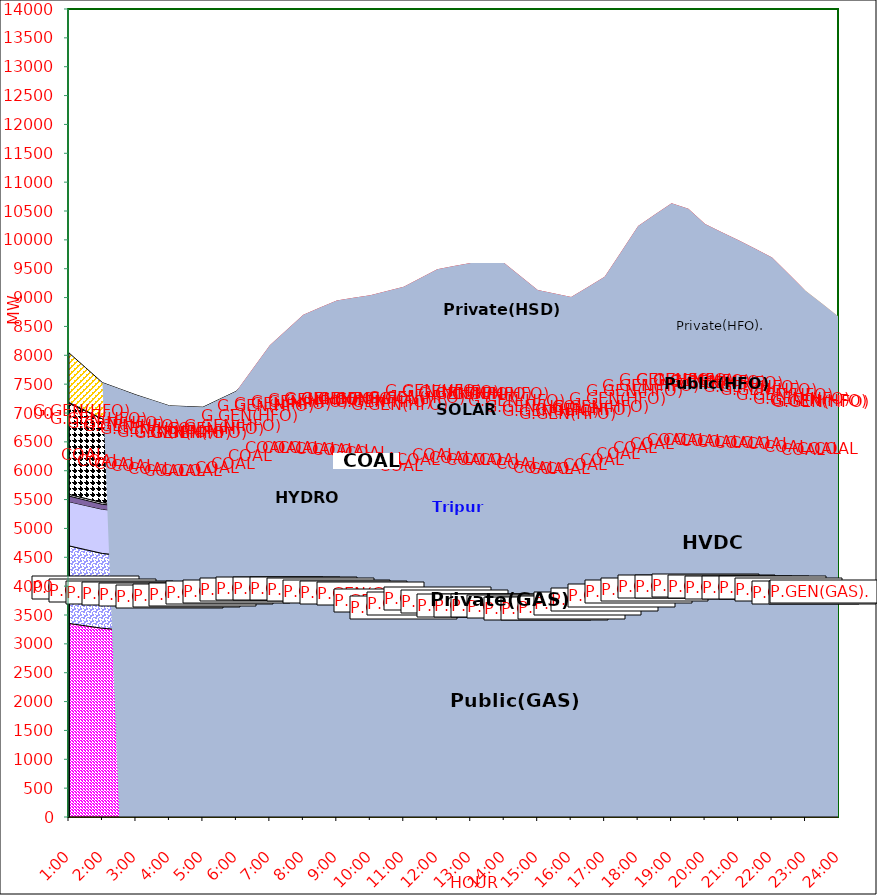
| Category | GAS | P.GEN(GAS). |  HVDC | TRIPURA | HYDRO | COAL | SOLAR | G.GEN(HFO) | P.GEN(HFO). | G.GEN(HSD) | P.GEN(HSD) | SHORTAGE | Total Energy Gen 209.351 MKWHr 
Energy Not Served   7.118 MKWHr 
Energy Requirement     216.469 MKWHr  |
|---|---|---|---|---|---|---|---|---|---|---|---|---|---|
| 1:00 | 3354 | 1344 | 765 | 98 | 30 | 1575 | 0 | 16 | 859 | 0 | 0 | 0 |  |
| 1:30 | 3312 | 1320 | 765 | 92 | 30 | 1513 | 0 | 8 | 743.5 | 0 | 0 | 0 |  |
| 2:00 | 3270 | 1296 | 765 | 86 | 30 | 1451 | 0 | 0 | 628 | 0 | 0 | 0 |  |
| 2:30 | 3247.5 | 1291.5 | 765 | 88 | 30 | 1421 | 0 | 0 | 577 | 0 | 0 | 0 |  |
| 3:00 | 3225 | 1287 | 765 | 90 | 30 | 1391 | 0 | 0 | 526 | 0 | 0 | 0 |  |
| 3:30 | 3224 | 1247.5 | 765 | 90 | 30 | 1376.5 | 0 | 0 | 486 | 0 | 0 | 0 |  |
| 4:00 | 3223 | 1208 | 765 | 90 | 30 | 1362 | 0 | 0 | 446 | 0 | 0 | 0 |  |
| 4:30 | 3237.5 | 1207 | 765 | 89 | 30 | 1342 | 0 | 0 | 442 | 0 | 0 | 0 |  |
| 5:00 | 3252 | 1206 | 765 | 88 | 30 | 1322 | 0 | 0 | 438 | 0 | 0 | 0 |  |
| 5:30 | 3254.5 | 1261.5 | 764.5 | 90 | 30 | 1327 | 0 | 0 | 511.5 | 0 | 0 | 0 |  |
| 6:00 | 3257 | 1317 | 764 | 92 | 30 | 1332 | 0 | 0 | 585 | 0 | 0 | 0 |  |
| 6:30 | 3261 | 1357 | 830 | 93 | 30 | 1387 | 1.5 | 9 | 721 | 0 | 0 | 86.5 |  |
| 7:00 | 3265 | 1397 | 896 | 94 | 30 | 1442 | 3 | 18 | 857 | 0 | 0 | 173 |  |
| 7:30 | 3272.5 | 1380 | 900.5 | 91 | 30 | 1456.5 | 25.5 | 30.5 | 895.5 | 0 | 0 | 357.443 |  |
| 8:00 | 3280 | 1363 | 905 | 88 | 30 | 1471 | 48 | 43 | 934 | 0 | 0 | 541.886 |  |
| 8:30 | 3253 | 1370 | 905.5 | 99 | 30 | 1462 | 88 | 48.5 | 1010.5 | 0 | 0 | 560.778 |  |
| 9:00 | 3226 | 1377 | 906 | 110 | 30 | 1453 | 128 | 54 | 1087 | 0 | 0 | 579.671 |  |
| 9:30 | 3216 | 1357.5 | 905.5 | 115 | 30 | 1438 | 167.5 | 51 | 1086.5 | 0 | 0 | 629.436 |  |
| 10:00 | 3206 | 1338 | 905 | 120 | 30 | 1423 | 207 | 48 | 1086 | 0 | 0 | 679.201 |  |
| 10:30 | 3074.5 | 1350.5 | 905.5 | 122 | 30 | 1442.5 | 236 | 83.5 | 1075.5 | 75 | 5 | 714.221 |  |
| 11:00 | 2943 | 1363 | 906 | 124 | 30 | 1462 | 265 | 119 | 1065 | 150 | 10 | 749.24 |  |
| 11:30 | 3017 | 1376 | 906 | 124 | 30 | 1467 | 278.5 | 145.5 | 1112.5 | 135 | 37.5 | 710.534 |  |
| 12:00 | 3091 | 1389 | 906 | 124 | 30 | 1472 | 292 | 172 | 1160 | 120 | 65 | 671.828 |  |
| 12:30 | 3027.5 | 1402.5 | 906 | 127 | 30 | 1486.5 | 290 | 193.5 | 1173.5 | 120 | 82.5 | 705.926 |  |
| 13:00 | 2964 | 1416 | 906 | 130 | 30 | 1501 | 288 | 215 | 1187 | 120 | 100 | 740.025 |  |
| 13:30 | 2964 | 1416 | 906 | 130 | 30 | 1501 | 288 | 215 | 1187 | 120 | 100 | 740.025 |  |
| 14:00 | 2964 | 1416 | 906 | 130 | 30 | 1501 | 288 | 215 | 1187 | 120 | 100 | 740.025 |  |
| 14:30 | 2973.5 | 1337.5 | 906 | 127 | 30 | 1499 | 230 | 241.5 | 1194.5 | 120.5 | 50 | 655.24 |  |
| 15:00 | 2983 | 1259 | 906 | 124 | 30 | 1497 | 172 | 268 | 1202 | 121 | 0 | 570.455 |  |
| 15:30 | 3002.5 | 1237 | 904 | 120 | 30 | 1497.5 | 129 | 263 | 1257 | 120.5 | 0 | 510.092 |  |
| 16:00 | 3022 | 1215 | 902 | 116 | 30 | 1498 | 86 | 258 | 1312 | 120 | 0 | 449.729 |  |
| 16:30 | 3082 | 1233 | 903 | 116 | 30 | 1498.5 | 53 | 276 | 1414 | 129 | 0 | 449.729 |  |
| 17:00 | 3142 | 1251 | 904 | 116 | 30 | 1499 | 20 | 294 | 1516 | 138 | 0 | 449.729 |  |
| 17:30 | 3178 | 1313.5 | 903.5 | 118 | 30 | 1504 | 10 | 390 | 1764.5 | 129 | 0 | 459.864 |  |
| 18:00 | 3214 | 1376 | 903 | 120 | 30 | 1509 | 0 | 486 | 2013 | 120 | 0 | 470 |  |
| 18:30 | 3244.5 | 1399.5 | 903.5 | 123 | 30 | 1534.5 | 0 | 498 | 2110 | 120 | 50 | 424.844 |  |
| 19:00 | 3275 | 1423 | 904 | 126 | 30 | 1560 | 0 | 510 | 2207 | 120 | 100 | 379.689 |  |
| 19:30 | 3291 | 1414 | 903 | 124 | 30 | 1574 | 0 | 495 | 2257 | 120 | 100 | 229.933 |  |
| 20:00 | 3328 | 1354 | 903 | 120 | 30 | 1573 | 0 | 501 | 2264 | 120 | 0 | 80.177 |  |
| 20:30 | 3304.5 | 1365.5 | 903 | 119 | 30 | 1573 | 0 | 488.5 | 2146 | 120 | 0 | 83.589 |  |
| 21:00 | 3281 | 1377 | 903 | 118 | 30 | 1573 | 0 | 476 | 2028 | 120 | 0 | 87 |  |
| 21:30 | 3289 | 1367 | 903 | 116 | 30 | 1552 | 0 | 416 | 1981 | 120 | 0 | 70 |  |
| 22:00 | 3297 | 1357 | 903 | 114 | 30 | 1531 | 0 | 356 | 1934 | 120 | 0 | 53 |  |
| 22:30 | 3259 | 1350.5 | 903 | 113 | 30 | 1530.5 | 0 | 283.5 | 1791 | 120 | 0 | 26.5 |  |
| 23:00 | 3221 | 1344 | 903 | 112 | 30 | 1530 | 0 | 211 | 1648 | 120 | 0 | 0 |  |
| 23:30 | 3218 | 1357 | 903.5 | 105 | 30 | 1531 | 0 | 153 | 1474 | 120 | 0 | 0 |  |
| 24:00 | 3215 | 1370 | 904 | 98 | 30 | 1532 | 0 | 95 | 1300 | 120 | 0 | 0 |  |